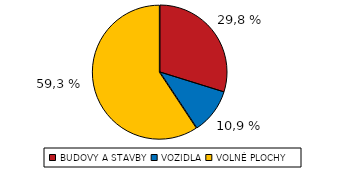
| Category | Series 0 |
|---|---|
| BUDOVY A STAVBY | 6028 |
| VOZIDLA | 2208 |
| VOLNÉ PLOCHY | 11996 |